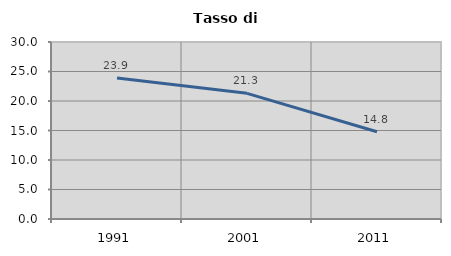
| Category | Tasso di disoccupazione   |
|---|---|
| 1991.0 | 23.9 |
| 2001.0 | 21.296 |
| 2011.0 | 14.78 |